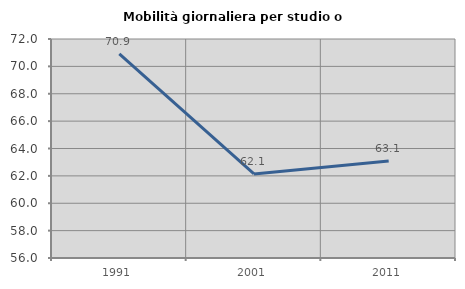
| Category | Mobilità giornaliera per studio o lavoro |
|---|---|
| 1991.0 | 70.91 |
| 2001.0 | 62.14 |
| 2011.0 | 63.086 |